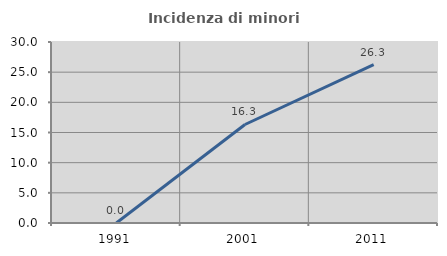
| Category | Incidenza di minori stranieri |
|---|---|
| 1991.0 | 0 |
| 2001.0 | 16.327 |
| 2011.0 | 26.257 |